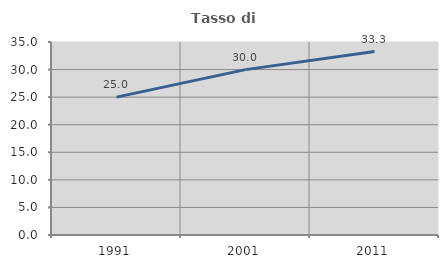
| Category | Tasso di occupazione   |
|---|---|
| 1991.0 | 25.006 |
| 2001.0 | 29.989 |
| 2011.0 | 33.27 |